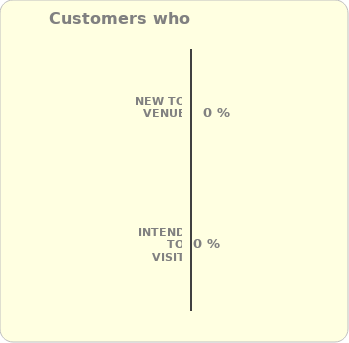
| Category | Series 0 |
|---|---|
| NEW to Venue | 0 |
| Intend to visit again | 0 |